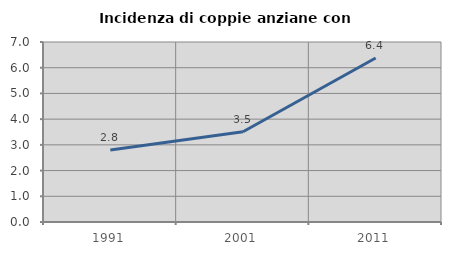
| Category | Incidenza di coppie anziane con figli |
|---|---|
| 1991.0 | 2.802 |
| 2001.0 | 3.509 |
| 2011.0 | 6.378 |